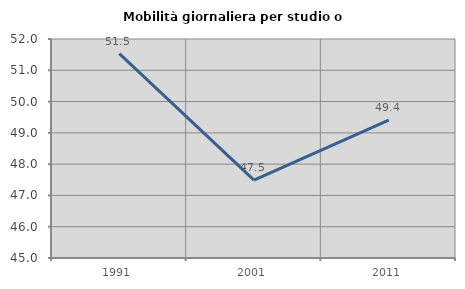
| Category | Mobilità giornaliera per studio o lavoro |
|---|---|
| 1991.0 | 51.533 |
| 2001.0 | 47.489 |
| 2011.0 | 49.405 |